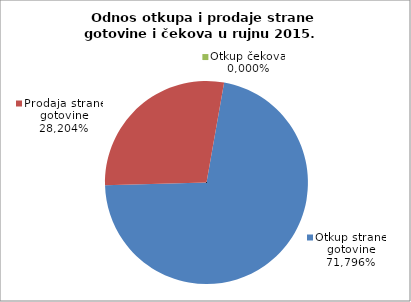
| Category | Otkup strane gotovine |
|---|---|
| 0 | 0.718 |
| 1 | 0.282 |
| 2 | 0 |